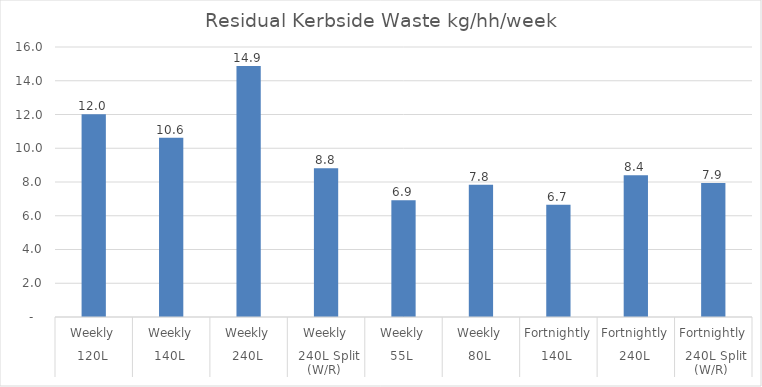
| Category |  kg/hh/wk  |
|---|---|
| 0 | 12.019 |
| 1 | 10.623 |
| 2 | 14.881 |
| 3 | 8.811 |
| 4 | 6.916 |
| 5 | 7.843 |
| 6 | 6.656 |
| 7 | 8.403 |
| 8 | 7.943 |